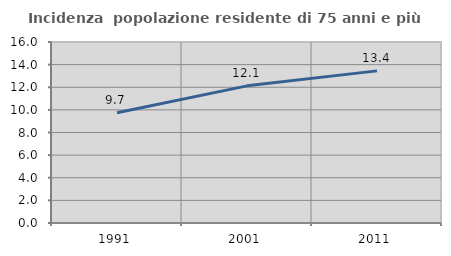
| Category | Incidenza  popolazione residente di 75 anni e più |
|---|---|
| 1991.0 | 9.746 |
| 2001.0 | 12.123 |
| 2011.0 | 13.448 |